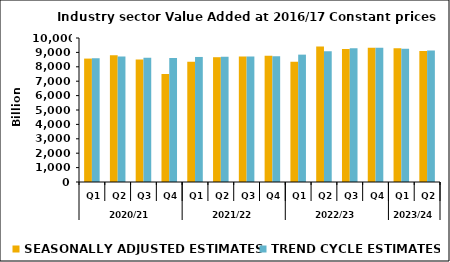
| Category | SEASONALLY ADJUSTED ESTIMATES | TREND CYCLE ESTIMATES |
|---|---|---|
| 0 | 8570.02 | 8597.786 |
| 1 | 8802.754 | 8722.252 |
| 2 | 8503.221 | 8631.999 |
| 3 | 7493.284 | 8608.186 |
| 4 | 8343.9 | 8683.463 |
| 5 | 8665.972 | 8696.323 |
| 6 | 8722.901 | 8720.11 |
| 7 | 8775.429 | 8728.724 |
| 8 | 8347.022 | 8844.674 |
| 9 | 9415.31 | 9085.947 |
| 10 | 9238.83 | 9280.07 |
| 11 | 9329.713 | 9319.746 |
| 12 | 9291.383 | 9253.411 |
| 13 | 9099.908 | 9129.406 |